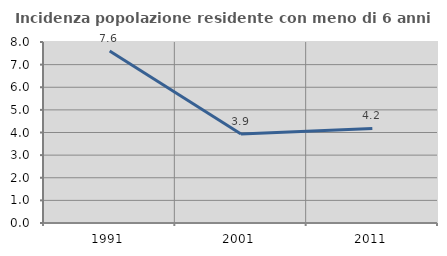
| Category | Incidenza popolazione residente con meno di 6 anni |
|---|---|
| 1991.0 | 7.599 |
| 2001.0 | 3.933 |
| 2011.0 | 4.179 |